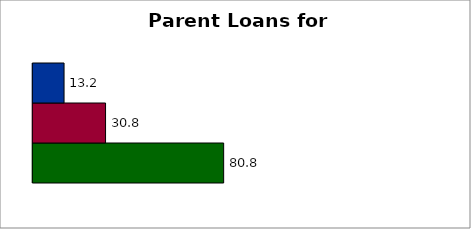
| Category | State | SREB states | 50 states and D.C. |
|---|---|---|---|
| 0 | 80.757 | 30.782 | 13.218 |